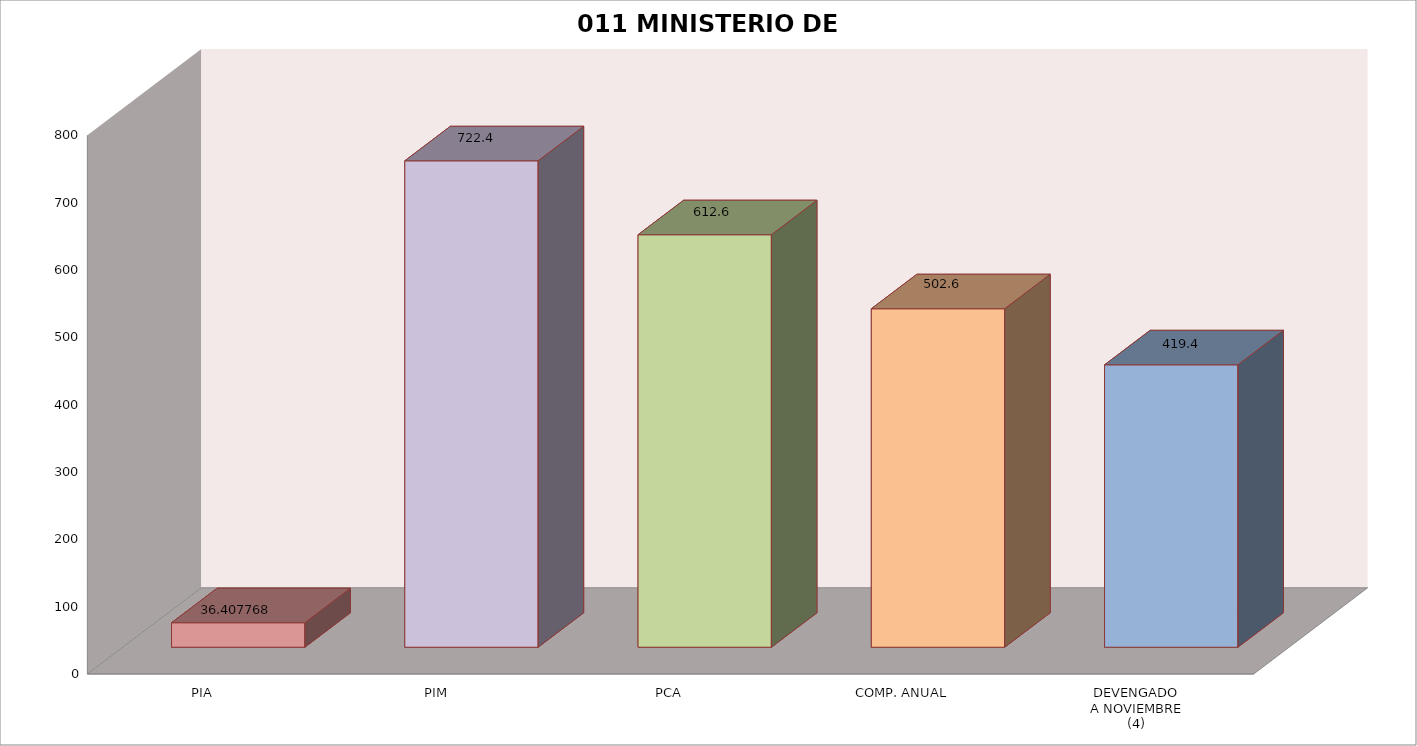
| Category | 011 MINISTERIO DE SALUD |
|---|---|
| PIA | 36.408 |
| PIM | 722.359 |
| PCA | 612.558 |
| COMP. ANUAL | 502.648 |
| DEVENGADO
A NOVIEMBRE
(4) | 419.394 |